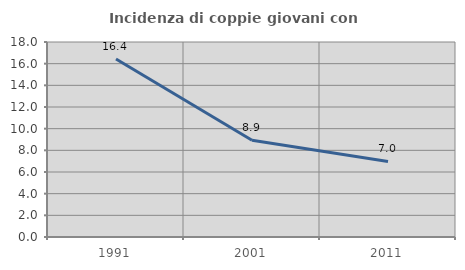
| Category | Incidenza di coppie giovani con figli |
|---|---|
| 1991.0 | 16.432 |
| 2001.0 | 8.931 |
| 2011.0 | 6.977 |